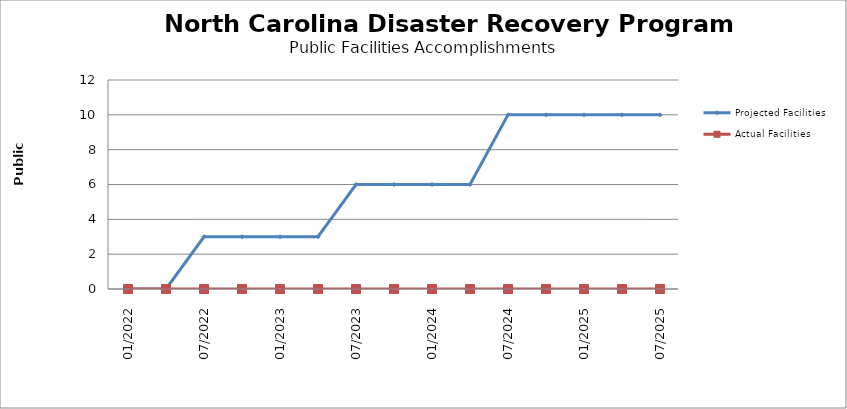
| Category | Projected Facilities | Actual Facilities |
|---|---|---|
| 01/2022 | 0 | 0 |
| 4/2022 | 0 | 0 |
| 07/2022 | 3 | 0 |
| 10/2022 | 3 | 0 |
| 01/2023 | 3 | 0 |
| 4/2023 | 3 | 0 |
| 07/2023 | 6 | 0 |
| 10/2023 | 6 | 0 |
| 01/2024 | 6 | 0 |
| 4/2024 | 6 | 0 |
| 07/2024 | 10 | 0 |
| 10/2024 | 10 | 0 |
| 01/2025 | 10 | 0 |
| 4/2025 | 10 | 0 |
| 07/2025 | 10 | 0 |